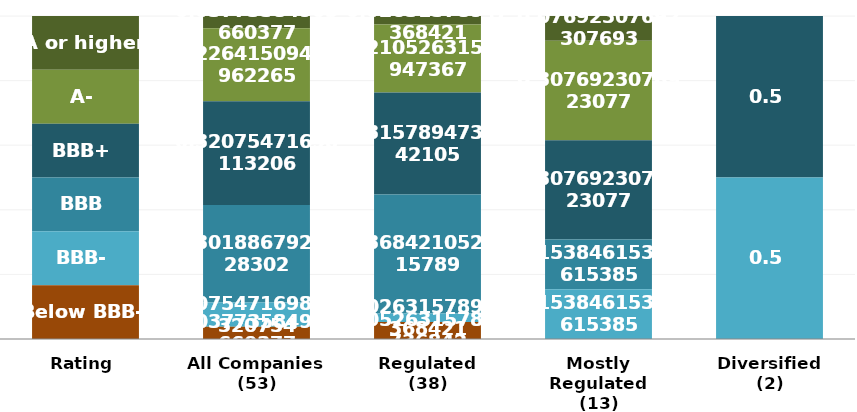
| Category | A or higher | A- | BBB+ | BBB | BBB- | Below BBB- |
|---|---|---|---|---|---|---|
| Rating | 1 | 1 | 1 | 1 | 1 | 1 |
| All Companies
(53) | 2 | 12 | 17 | 16 | 4 | 2 |
| Regulated
(38) | 1 | 8 | 12 | 14 | 1 | 2 |
| Mostly Regulated
(13) | 1 | 4 | 4 | 2 | 2 | 0 |
| Diversified
(2) | 0 | 0 | 1 | 0 | 1 | 0 |